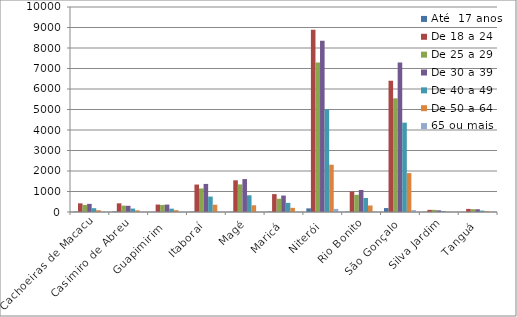
| Category | Até  17 anos | De 18 a 24 | De 25 a 29 | De 30 a 39 | De 40 a 49 | De 50 a 64 | 65 ou mais |
|---|---|---|---|---|---|---|---|
| Cachoeiras de Macacu | 15 | 422 | 345 | 397 | 185 | 86 | 6 |
| Casimiro de Abreu | 24 | 423 | 310 | 303 | 167 | 80 | 10 |
| Guapimirim  | 7 | 363 | 345 | 362 | 162 | 88 | 5 |
| Itaboraí | 16 | 1339 | 1149 | 1370 | 752 | 355 | 16 |
| Magé | 14 | 1546 | 1345 | 1606 | 816 | 327 | 10 |
| Maricá | 18 | 872 | 646 | 803 | 446 | 203 | 9 |
| Niterói | 177 | 8891 | 7288 | 8351 | 5007 | 2307 | 151 |
| Rio Bonito | 15 | 1001 | 837 | 1075 | 684 | 318 | 21 |
| São Gonçalo | 191 | 6401 | 5545 | 7294 | 4359 | 1899 | 92 |
| Silva Jardim | 7 | 104 | 104 | 81 | 46 | 17 | 0 |
| Tanguá | 4 | 151 | 137 | 134 | 68 | 42 | 4 |